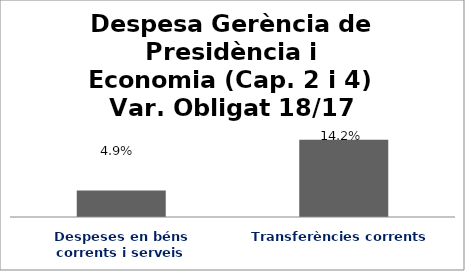
| Category | Series 0 |
|---|---|
| Despeses en béns corrents i serveis | 0.049 |
| Transferències corrents | 0.142 |